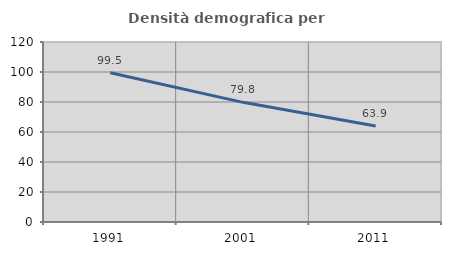
| Category | Densità demografica |
|---|---|
| 1991.0 | 99.542 |
| 2001.0 | 79.772 |
| 2011.0 | 63.943 |